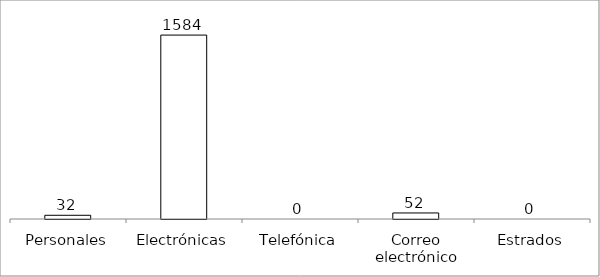
| Category | Series 0 |
|---|---|
| Personales | 32 |
| Electrónicas | 1584 |
| Telefónica | 0 |
| Correo electrónico | 52 |
| Estrados | 0 |